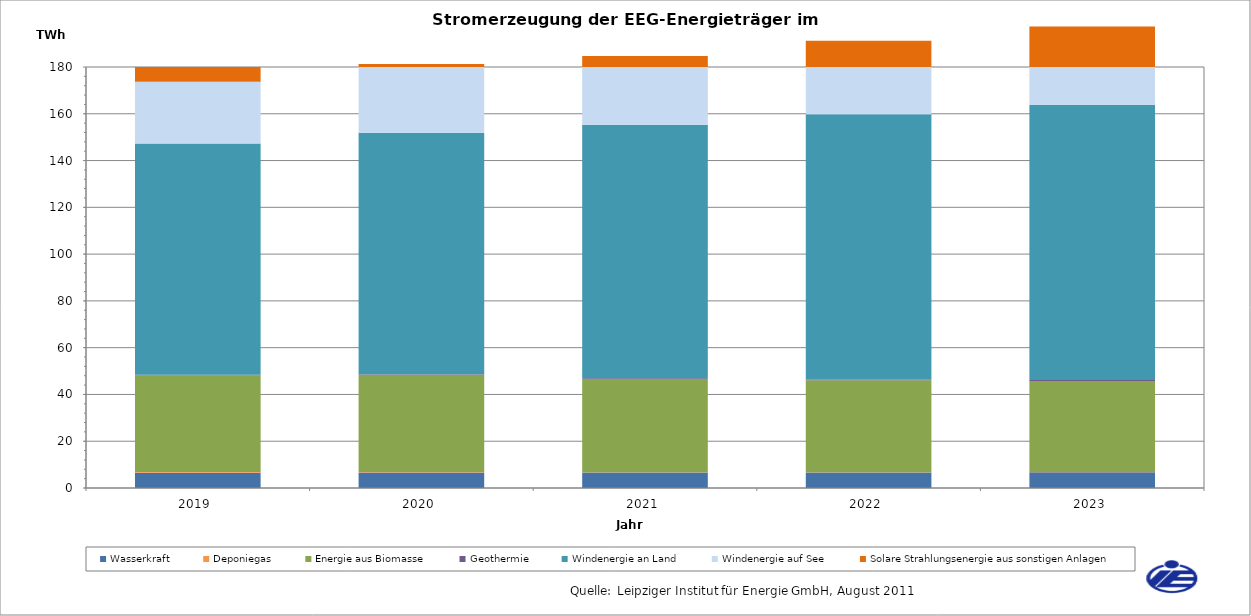
| Category | Wasserkraft | Deponiegas | Energie aus Biomasse | Geothermie | Windenergie an Land | Windenergie auf See | Solare Strahlungsenergie aus sonstigen Anlagen |
|---|---|---|---|---|---|---|---|
| 2019.0 | 6514.587 | 301.193 | 41351.62 | 286.386 | 98799.183 | 26466.161 | 29472.576 |
| 2020.0 | 6579.213 | 279.403 | 41517.18 | 311.858 | 103214.502 | 29387.973 | 31131.168 |
| 2021.0 | 6607.816 | 143.241 | 39872.884 | 335.633 | 108375.196 | 29373.851 | 32698.217 |
| 2022.0 | 6654.341 | 106.025 | 39296.779 | 360.21 | 113428.189 | 31352.828 | 33999.158 |
| 2023.0 | 6700.926 | 94.786 | 38943.147 | 384.818 | 117767.902 | 33371.728 | 34914.597 |